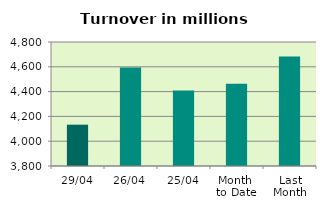
| Category | Series 0 |
|---|---|
| 29/04 | 4133.23 |
| 26/04 | 4594.668 |
| 25/04 | 4408.517 |
| Month 
to Date | 4464.042 |
| Last
Month | 4683.179 |